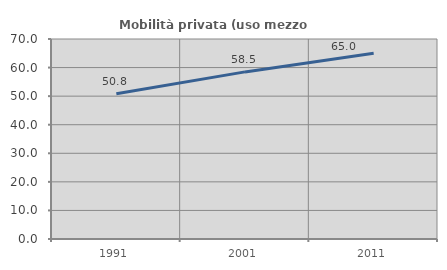
| Category | Mobilità privata (uso mezzo privato) |
|---|---|
| 1991.0 | 50.801 |
| 2001.0 | 58.488 |
| 2011.0 | 65.041 |